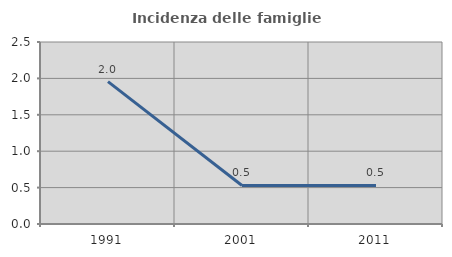
| Category | Incidenza delle famiglie numerose |
|---|---|
| 1991.0 | 1.955 |
| 2001.0 | 0.53 |
| 2011.0 | 0.53 |